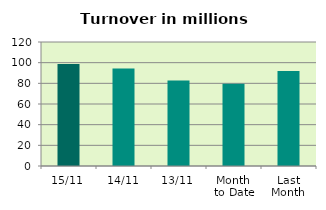
| Category | Series 0 |
|---|---|
| 15/11 | 98.682 |
| 14/11 | 94.442 |
| 13/11 | 82.854 |
| Month 
to Date | 79.59 |
| Last
Month | 91.964 |